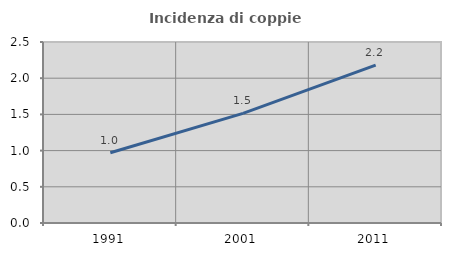
| Category | Incidenza di coppie miste |
|---|---|
| 1991.0 | 0.97 |
| 2001.0 | 1.514 |
| 2011.0 | 2.182 |